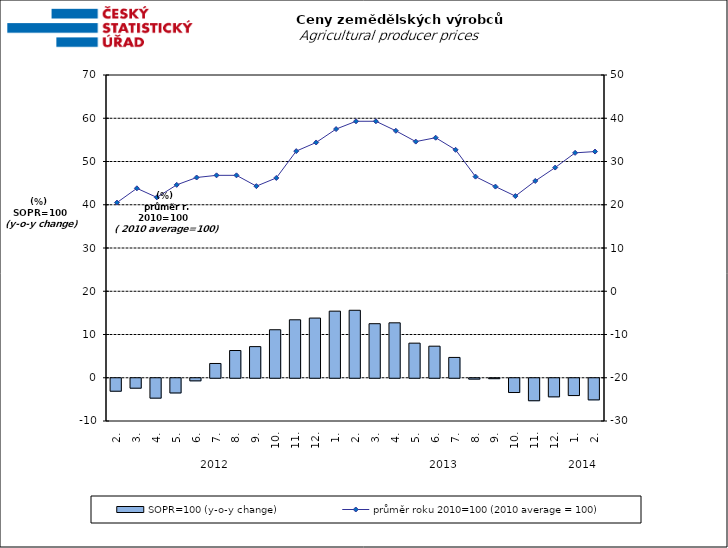
| Category | SOPR=100 (y-o-y change)   |
|---|---|
| 0 | -3 |
| 1 | -2.3 |
| 2 | -4.6 |
| 3 | -3.4 |
| 4 | -0.6 |
| 5 | 3.3 |
| 6 | 6.3 |
| 7 | 7.2 |
| 8 | 11.1 |
| 9 | 13.4 |
| 10 | 13.8 |
| 11 | 15.4 |
| 12 | 15.6 |
| 13 | 12.5 |
| 14 | 12.7 |
| 15 | 8 |
| 16 | 7.3 |
| 17 | 4.7 |
| 18 | -0.2 |
| 19 | -0.1 |
| 20 | -3.3 |
| 21 | -5.2 |
| 22 | -4.3 |
| 23 | -4 |
| 24 | -5 |